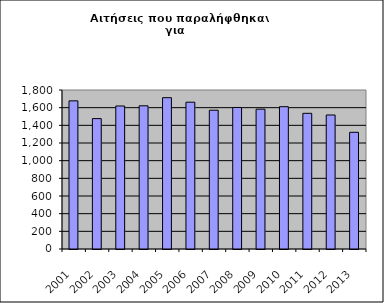
| Category | Series 1 |
|---|---|
| 2001.0 | 1677 |
| 2002.0 | 1476 |
| 2003.0 | 1619 |
| 2004.0 | 1621 |
| 2005.0 | 1713 |
| 2006.0 | 1662 |
| 2007.0 | 1571 |
| 2008.0 | 1602 |
| 2009.0 | 1583 |
| 2010.0 | 1611 |
| 2011.0 | 1536 |
| 2012.0 | 1517 |
| 2013.0 | 1321 |